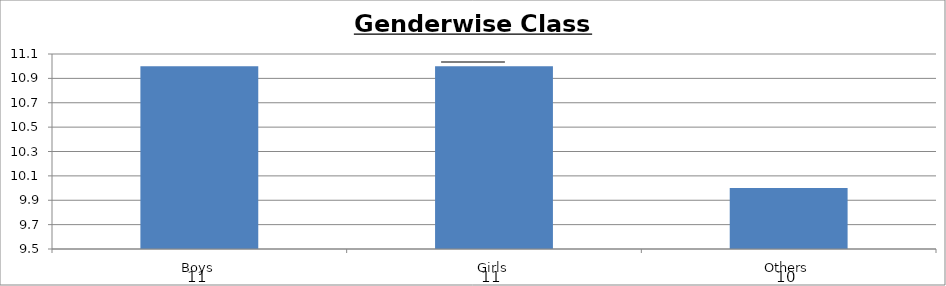
| Category | Series 0 |
|---|---|
| Boys | 11 |
| Girls | 11 |
| Others | 10 |